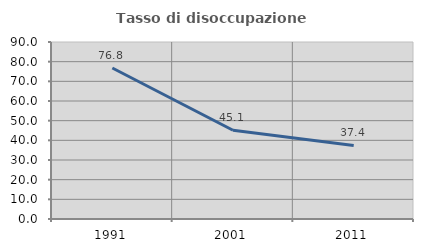
| Category | Tasso di disoccupazione giovanile  |
|---|---|
| 1991.0 | 76.768 |
| 2001.0 | 45.139 |
| 2011.0 | 37.43 |